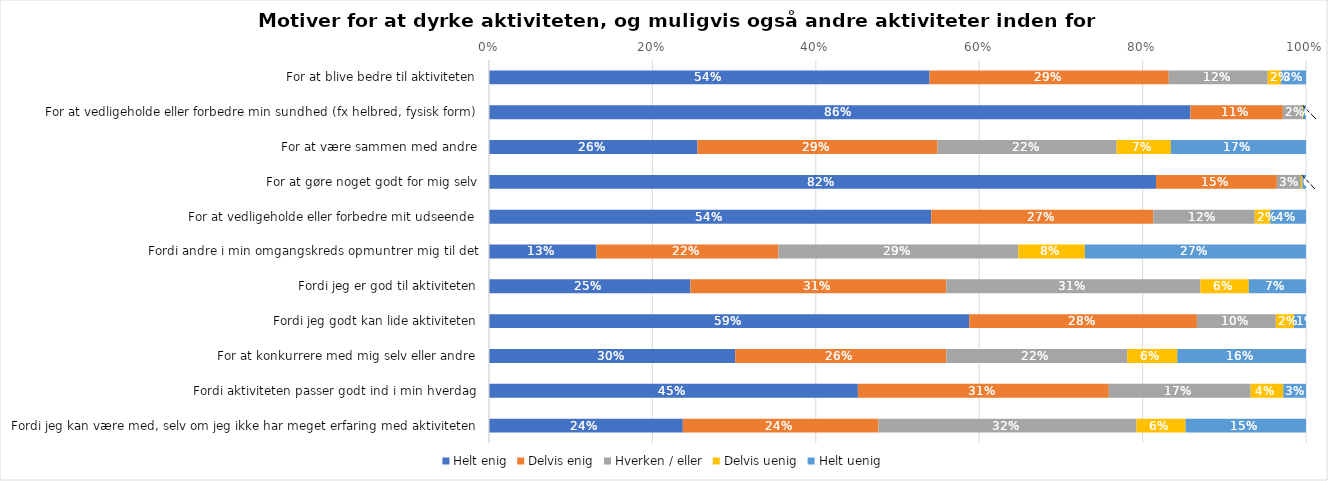
| Category | Helt enig | Delvis enig | Hverken / eller | Delvis uenig | Helt uenig |
|---|---|---|---|---|---|
| For at blive bedre til aktiviteten | 0.539 | 0.293 | 0.121 | 0.016 | 0.031 |
| For at vedligeholde eller forbedre min sundhed (fx helbred, fysisk form) | 0.859 | 0.113 | 0.024 | 0.001 | 0.004 |
| For at være sammen med andre | 0.255 | 0.294 | 0.219 | 0.066 | 0.165 |
| For at gøre noget godt for mig selv | 0.816 | 0.148 | 0.029 | 0.002 | 0.004 |
| For at vedligeholde eller forbedre mit udseende | 0.541 | 0.272 | 0.124 | 0.019 | 0.044 |
| Fordi andre i min omgangskreds opmuntrer mig til det | 0.132 | 0.223 | 0.294 | 0.081 | 0.271 |
| Fordi jeg er god til aktiviteten | 0.247 | 0.313 | 0.311 | 0.059 | 0.07 |
| Fordi jeg godt kan lide aktiviteten | 0.588 | 0.279 | 0.097 | 0.022 | 0.015 |
| For at konkurrere med mig selv eller andre | 0.301 | 0.258 | 0.222 | 0.061 | 0.158 |
| Fordi aktiviteten passer godt ind i min hverdag | 0.452 | 0.307 | 0.174 | 0.04 | 0.028 |
| Fordi jeg kan være med, selv om jeg ikke har meget erfaring med aktiviteten | 0.237 | 0.239 | 0.316 | 0.06 | 0.147 |